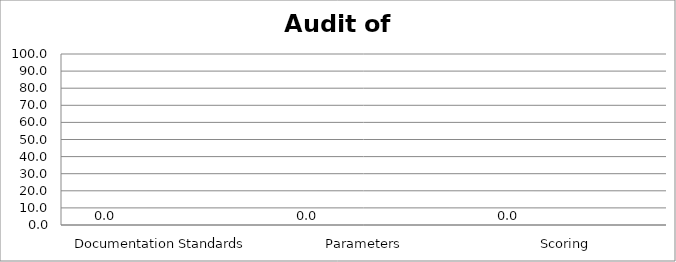
| Category | Series 0 | Series 1 | Series 2 | Series 3 |
|---|---|---|---|---|
|  Documentation Standards | 0 |  |  |  |
|  Parameters | 0 |  |  |  |
|  Scoring | 0 |  |  |  |